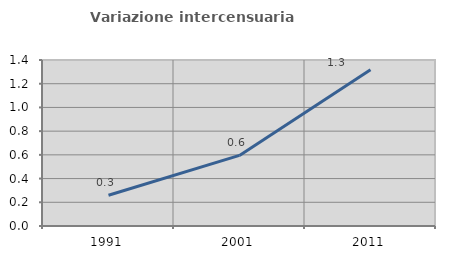
| Category | Variazione intercensuaria annua |
|---|---|
| 1991.0 | 0.26 |
| 2001.0 | 0.595 |
| 2011.0 | 1.318 |